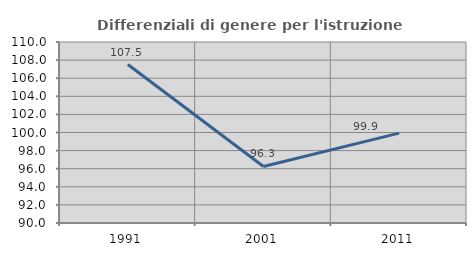
| Category | Differenziali di genere per l'istruzione superiore |
|---|---|
| 1991.0 | 107.509 |
| 2001.0 | 96.25 |
| 2011.0 | 99.928 |